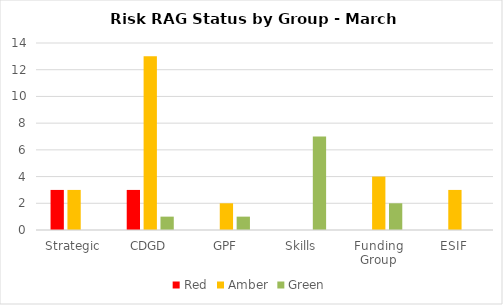
| Category | Red | Amber | Green |
|---|---|---|---|
| Strategic | 3 | 3 | 0 |
| CDGD | 3 | 13 | 1 |
| GPF | 0 | 2 | 1 |
| Skills | 0 | 0 | 7 |
| Funding Group | 0 | 4 | 2 |
| ESIF | 0 | 3 | 0 |